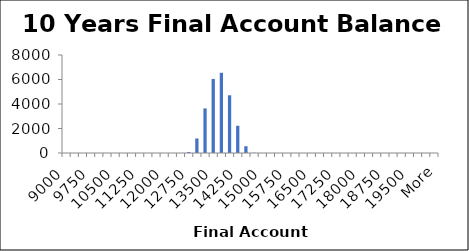
| Category | Frequency |
|---|---|
| 9000.0 | 0 |
| 9250.0 | 0 |
| 9500.0 | 0 |
| 9750.0 | 0 |
| 10000.0 | 0 |
| 10250.0 | 0 |
| 10500.0 | 0 |
| 10750.0 | 0 |
| 11000.0 | 0 |
| 11250.0 | 0 |
| 11500.0 | 0 |
| 11750.0 | 0 |
| 12000.0 | 0 |
| 12250.0 | 0 |
| 12500.0 | 0 |
| 12750.0 | 76 |
| 13000.0 | 1185 |
| 13250.0 | 3642 |
| 13500.0 | 6046 |
| 13750.0 | 6546 |
| 14000.0 | 4713 |
| 14250.0 | 2223 |
| 14500.0 | 554 |
| 14750.0 | 15 |
| 15000.0 | 0 |
| 15250.0 | 0 |
| 15500.0 | 0 |
| 15750.0 | 0 |
| 16000.0 | 0 |
| 16250.0 | 0 |
| 16500.0 | 0 |
| 16750.0 | 0 |
| 17000.0 | 0 |
| 17250.0 | 0 |
| 17500.0 | 0 |
| 17750.0 | 0 |
| 18000.0 | 0 |
| 18250.0 | 0 |
| 18500.0 | 0 |
| 18750.0 | 0 |
| 19000.0 | 0 |
| 19250.0 | 0 |
| 19500.0 | 0 |
| 19750.0 | 0 |
| 20000.0 | 0 |
| More | 0 |